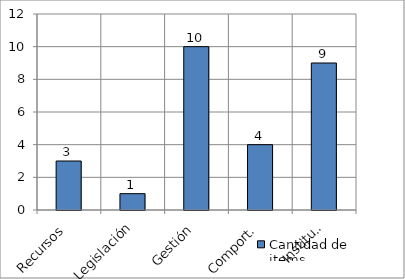
| Category | Cantidad de items |
|---|---|
| Recursos | 3 |
| Legislación | 1 |
| Gestión | 10 |
| Comport. | 4 |
| Instituc. | 9 |